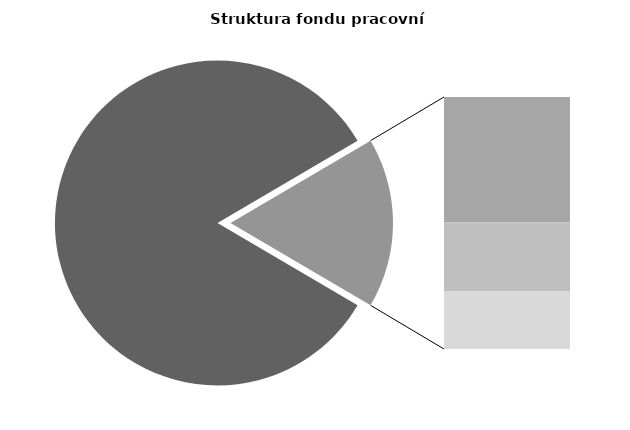
| Category | Series 0 |
|---|---|
| Průměrná měsíční odpracovaná doba bez přesčasu | 141.23 |
| Dovolená | 14.31 |
| Nemoc | 7.816 |
| Jiné | 6.631 |